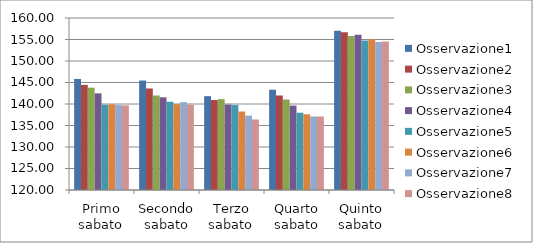
| Category | Osservazione1 | Osservazione2 | Osservazione3 | Osservazione4 | Osservazione5 | Osservazione6 | Osservazione7 | Osservazione8 |
|---|---|---|---|---|---|---|---|---|
| Primo sabato | 145.822 | 144.444 | 143.802 | 142.479 | 139.835 | 139.916 | 139.744 | 139.688 |
| Secondo sabato | 145.455 | 143.614 | 141.984 | 141.553 | 140.522 | 139.944 | 140.423 | 139.831 |
| Terzo sabato | 141.826 | 140.921 | 141.144 | 139.865 | 139.754 | 138.251 | 137.293 | 136.401 |
| Quarto sabato | 143.316 | 141.979 | 141.043 | 139.628 | 137.973 | 137.601 | 137.092 | 137.092 |
| Quinto sabato | 157.046 | 156.676 | 155.827 | 156.098 | 154.768 | 155.041 | 154.396 | 154.533 |